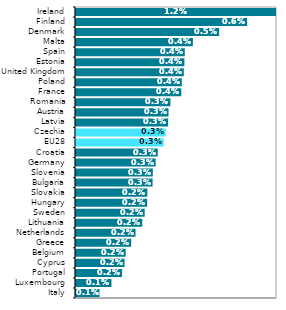
| Category | Series 0 |
|---|---|
| Italy | 0.001 |
| Luxembourg | 0.001 |
| Portugal | 0.002 |
| Cyprus | 0.002 |
| Belgium | 0.002 |
| Greece | 0.002 |
| Netherlands | 0.002 |
| Lithuania | 0.002 |
| Sweden | 0.002 |
| Hungary | 0.002 |
| Slovakia | 0.002 |
| Bulgaria | 0.003 |
| Slovenia | 0.003 |
| Germany | 0.003 |
| Croatia | 0.003 |
| EU28 | 0.003 |
| Czechia | 0.003 |
| Latvia | 0.003 |
| Austria | 0.003 |
| Romania | 0.003 |
| France | 0.004 |
| Poland | 0.004 |
| United Kingdom | 0.004 |
| Estonia | 0.004 |
| Spain | 0.004 |
| Malta | 0.004 |
| Denmark | 0.005 |
| Finland | 0.006 |
| Ireland | 0.012 |